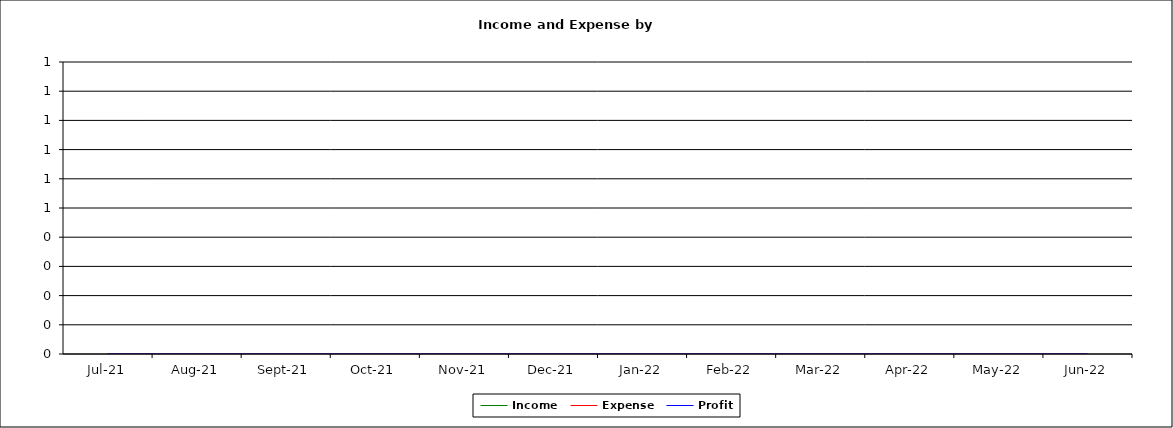
| Category | Income | Expense | Profit |
|---|---|---|---|
| 2021-07-01 | 0 | 0 | 0 |
| 2021-08-01 | 0 | 0 | 0 |
| 2021-09-01 | 0 | 0 | 0 |
| 2021-10-02 | 0 | 0 | 0 |
| 2021-11-02 | 0 | 0 | 0 |
| 2021-12-03 | 0 | 0 | 0 |
| 2022-01-03 | 0 | 0 | 0 |
| 2022-02-03 | 0 | 0 | 0 |
| 2022-03-06 | 0 | 0 | 0 |
| 2022-04-06 | 0 | 0 | 0 |
| 2022-05-07 | 0 | 0 | 0 |
| 2022-06-07 | 0 | 0 | 0 |